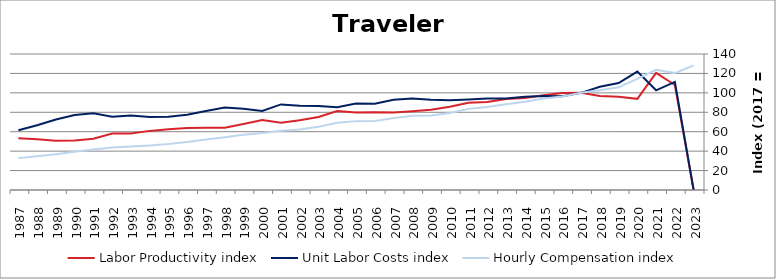
| Category | Labor Productivity index | Unit Labor Costs index | Hourly Compensation index |
|---|---|---|---|
| 2023.0 | 0 | 0 | 128.341 |
| 2022.0 | 108.069 | 111.357 | 120.342 |
| 2021.0 | 120.569 | 102.616 | 123.723 |
| 2020.0 | 93.832 | 121.859 | 114.343 |
| 2019.0 | 96.023 | 110.049 | 105.672 |
| 2018.0 | 96.774 | 106.219 | 102.793 |
| 2017.0 | 100 | 100 | 100 |
| 2016.0 | 99.852 | 96.397 | 96.255 |
| 2015.0 | 97.504 | 96.694 | 94.28 |
| 2014.0 | 94.677 | 96.063 | 90.949 |
| 2013.0 | 93.582 | 94.206 | 88.16 |
| 2012.0 | 90.583 | 94.205 | 85.334 |
| 2011.0 | 89.729 | 93.066 | 83.508 |
| 2010.0 | 85.797 | 92.346 | 79.23 |
| 2009.0 | 82.587 | 92.834 | 76.669 |
| 2008.0 | 81.065 | 94.29 | 76.436 |
| 2007.0 | 79.685 | 92.845 | 73.983 |
| 2006.0 | 80.144 | 88.77 | 71.144 |
| 2005.0 | 79.685 | 88.974 | 70.899 |
| 2004.0 | 81.226 | 85.216 | 69.218 |
| 2003.0 | 75.199 | 86.465 | 65.021 |
| 2002.0 | 71.807 | 86.768 | 62.305 |
| 2001.0 | 69.303 | 88.095 | 61.052 |
| 2000.0 | 72.068 | 81.407 | 58.669 |
| 1999.0 | 67.96 | 83.585 | 56.804 |
| 1998.0 | 64.136 | 84.847 | 54.418 |
| 1997.0 | 64.004 | 81.403 | 52.101 |
| 1996.0 | 63.729 | 77.529 | 49.409 |
| 1995.0 | 62.572 | 75.511 | 47.249 |
| 1994.0 | 60.856 | 75.127 | 45.72 |
| 1993.0 | 58.225 | 76.75 | 44.687 |
| 1992.0 | 58.072 | 75.454 | 43.818 |
| 1991.0 | 52.741 | 78.916 | 41.621 |
| 1990.0 | 50.89 | 77.143 | 39.258 |
| 1989.0 | 50.759 | 72.576 | 36.839 |
| 1988.0 | 52.127 | 66.641 | 34.738 |
| 1987.0 | 53.328 | 61.523 | 32.809 |